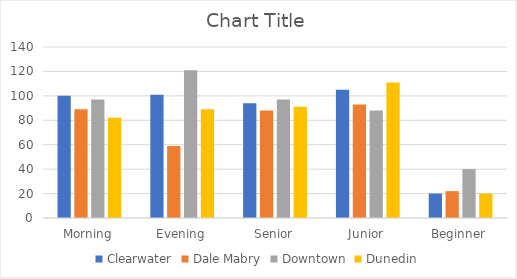
| Category | Clearwater | Dale Mabry | Downtown | Dunedin |
|---|---|---|---|---|
| Morning | 100 | 89 | 97 | 82 |
| Evening | 101 | 59 | 121 | 89 |
| Senior | 94 | 88 | 97 | 91 |
| Junior | 105 | 93 | 88 | 111 |
| Beginner | 20 | 22 | 40 | 20 |